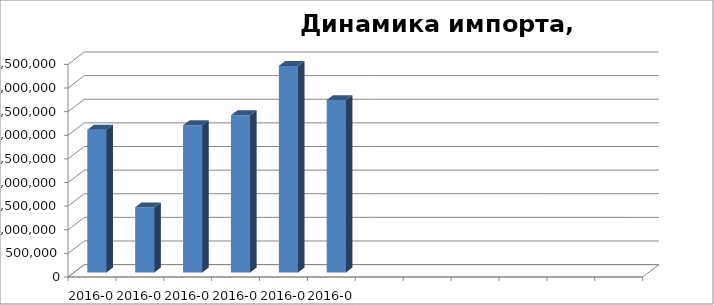
| Category | Стоимость, USD |
|---|---|
| 2016-01 | 3020083.97 |
| 2016-02 | 1378836.73 |
| 2016-03 | 3116313.83 |
| 2016-04 | 3327030.97 |
| 2016-05 | 4372128.05 |
| 2016-06 | 3648886.63 |